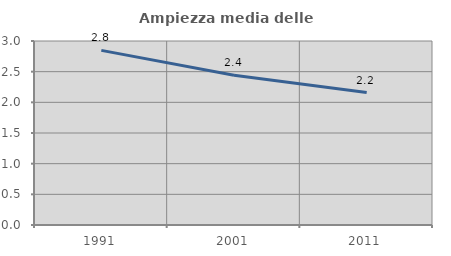
| Category | Ampiezza media delle famiglie |
|---|---|
| 1991.0 | 2.847 |
| 2001.0 | 2.441 |
| 2011.0 | 2.16 |